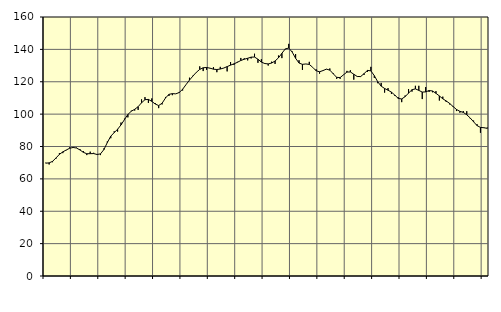
| Category | Piggar | Series 1 |
|---|---|---|
| nan | 70 | 69.7 |
| 87.0 | 68.9 | 69.88 |
| 87.0 | 70.3 | 70.83 |
| 87.0 | 72.5 | 72.91 |
| nan | 75.9 | 75.14 |
| 88.0 | 75.9 | 76.68 |
| 88.0 | 77.7 | 77.84 |
| 88.0 | 79.5 | 78.91 |
| nan | 79.7 | 79.4 |
| 89.0 | 79.3 | 79.06 |
| 89.0 | 78.4 | 77.86 |
| 89.0 | 77.2 | 76.39 |
| nan | 74.7 | 75.53 |
| 90.0 | 76.8 | 75.56 |
| 90.0 | 76.1 | 75.63 |
| 90.0 | 75.2 | 75.07 |
| nan | 74.7 | 75.44 |
| 91.0 | 78.8 | 78.09 |
| 91.0 | 83.1 | 82.44 |
| 91.0 | 85.1 | 86.37 |
| nan | 89.4 | 88.59 |
| 92.0 | 89.2 | 90.64 |
| 92.0 | 94.8 | 93.35 |
| 92.0 | 97.2 | 96.59 |
| nan | 98 | 99.78 |
| 93.0 | 102.1 | 101.79 |
| 93.0 | 102.2 | 102.98 |
| 93.0 | 102.6 | 104.58 |
| nan | 109.1 | 107.02 |
| 94.0 | 110.5 | 108.91 |
| 94.0 | 106.9 | 109.1 |
| 94.0 | 109.7 | 107.88 |
| nan | 106.8 | 106.23 |
| 95.0 | 103.7 | 105.3 |
| 95.0 | 106 | 106.74 |
| 95.0 | 110.6 | 109.98 |
| nan | 111.2 | 112.22 |
| 96.0 | 111.7 | 112.66 |
| 96.0 | 112.5 | 112.52 |
| 96.0 | 113.7 | 113.34 |
| nan | 114.6 | 115.37 |
| 97.0 | 118.2 | 118.25 |
| 97.0 | 122.5 | 121.02 |
| 97.0 | 123.7 | 123.5 |
| nan | 125.7 | 125.83 |
| 98.0 | 129.5 | 127.63 |
| 98.0 | 126.6 | 128.64 |
| 98.0 | 127.4 | 128.81 |
| nan | 128.3 | 128.39 |
| 99.0 | 129 | 127.77 |
| 99.0 | 125.9 | 127.55 |
| 99.0 | 129.2 | 127.85 |
| nan | 128.4 | 128.47 |
| 0.0 | 126.4 | 129.35 |
| 0.0 | 132.2 | 130.27 |
| 0.0 | 130.4 | 131.07 |
| nan | 132.3 | 132 |
| 1.0 | 134.7 | 133.13 |
| 1.0 | 134.5 | 133.89 |
| 1.0 | 133.2 | 134.5 |
| nan | 134.4 | 135.2 |
| 2.0 | 137.3 | 135.27 |
| 2.0 | 131.7 | 133.92 |
| 2.0 | 133.9 | 132.14 |
| nan | 131 | 131.25 |
| 3.0 | 130 | 131.03 |
| 3.0 | 132.4 | 131.55 |
| 3.0 | 131 | 132.81 |
| nan | 136.2 | 134.78 |
| 4.0 | 134.6 | 137.57 |
| 4.0 | 140.1 | 140.3 |
| 4.0 | 143.4 | 140.82 |
| nan | 138.7 | 138.34 |
| 5.0 | 137.1 | 134.5 |
| 5.0 | 133.3 | 131.55 |
| 5.0 | 127.3 | 130.76 |
| nan | 131 | 130.98 |
| 6.0 | 132.3 | 130.7 |
| 6.0 | 128.9 | 128.91 |
| 6.0 | 127.7 | 126.77 |
| nan | 125 | 126.16 |
| 7.0 | 127 | 126.9 |
| 7.0 | 127.9 | 127.79 |
| 7.0 | 128.2 | 127.18 |
| nan | 125.3 | 124.92 |
| 8.0 | 121.8 | 122.73 |
| 8.0 | 121.8 | 122.56 |
| 8.0 | 124.4 | 124.29 |
| nan | 126.7 | 125.99 |
| 9.0 | 127.1 | 126.05 |
| 9.0 | 121.3 | 124.65 |
| 9.0 | 123.4 | 123.26 |
| nan | 123.4 | 123.2 |
| 10.0 | 124.2 | 125.03 |
| 10.0 | 126.1 | 127 |
| 10.0 | 129.2 | 126.73 |
| nan | 122.4 | 123.74 |
| 11.0 | 119.1 | 119.98 |
| 11.0 | 119.3 | 117.27 |
| 11.0 | 113.3 | 115.84 |
| nan | 116.1 | 114.78 |
| 12.0 | 112.5 | 113.58 |
| 12.0 | 111.2 | 111.73 |
| 12.0 | 110.4 | 109.67 |
| nan | 107.4 | 109.39 |
| 13.0 | 111.5 | 110.8 |
| 13.0 | 115.5 | 113 |
| 13.0 | 113.9 | 115.07 |
| nan | 117.5 | 115.59 |
| 14.0 | 117.5 | 114.66 |
| 14.0 | 109.3 | 113.62 |
| 14.0 | 116.7 | 113.74 |
| nan | 113.7 | 114.58 |
| 15.0 | 113.5 | 114.29 |
| 15.0 | 114.2 | 112.86 |
| 15.0 | 108.4 | 111.24 |
| nan | 110.8 | 109.46 |
| 16.0 | 107.5 | 108.14 |
| 16.0 | 106 | 106.61 |
| 16.0 | 105 | 104.7 |
| nan | 101.9 | 102.89 |
| 17.0 | 100.9 | 101.71 |
| 17.0 | 101.9 | 101.07 |
| 17.0 | 101.8 | 99.6 |
| nan | 97.4 | 97.63 |
| 18.0 | 96 | 95.25 |
| 18.0 | 93.8 | 92.92 |
| 18.0 | 88.5 | 91.79 |
| nan | 91.8 | 91.59 |
| 19.0 | 91.7 | 91.21 |